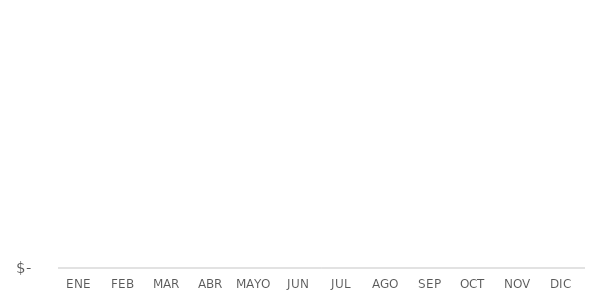
| Category | Series 0 |
|---|---|
| ENE | 0 |
| FEB | 0 |
| MAR | 0 |
| ABR | 0 |
| MAYO | 0 |
| JUN | 0 |
| JUL | 0 |
| AGO | 0 |
| SEP | 0 |
| OCT | 0 |
| NOV | 0 |
| DIC | 0 |